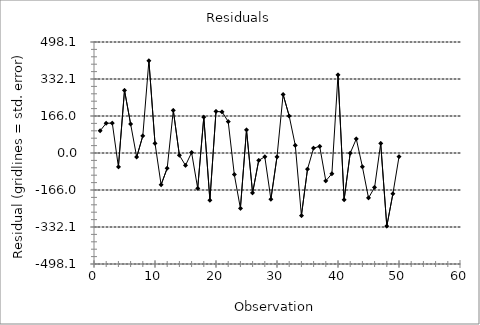
| Category | Series 0 |
|---|---|
| 1.0 | 99.434 |
| 2.0 | 133.589 |
| 3.0 | 134.136 |
| 4.0 | -62.296 |
| 5.0 | 281.259 |
| 6.0 | 130.577 |
| 7.0 | -18.088 |
| 8.0 | 76.675 |
| 9.0 | 414.067 |
| 10.0 | 43.638 |
| 11.0 | -142.492 |
| 12.0 | -68.313 |
| 13.0 | 191.259 |
| 14.0 | -10.472 |
| 15.0 | -55.492 |
| 16.0 | 1.969 |
| 17.0 | -158.533 |
| 18.0 | 160.806 |
| 19.0 | -211.909 |
| 20.0 | 186.271 |
| 21.0 | 184.552 |
| 22.0 | 140.989 |
| 23.0 | -96.525 |
| 24.0 | -248.399 |
| 25.0 | 103.291 |
| 26.0 | -178.896 |
| 27.0 | -33.256 |
| 28.0 | -16.909 |
| 29.0 | -207.435 |
| 30.0 | -16.966 |
| 31.0 | 262.752 |
| 32.0 | 165.887 |
| 33.0 | 34.042 |
| 34.0 | -280.966 |
| 35.0 | -72.517 |
| 36.0 | 21.977 |
| 37.0 | 29.879 |
| 38.0 | -125.068 |
| 39.0 | -92.856 |
| 40.0 | 350.806 |
| 41.0 | -210.145 |
| 42.0 | -0.656 |
| 43.0 | 63.099 |
| 44.0 | -61.737 |
| 45.0 | -201.807 |
| 46.0 | -154.292 |
| 47.0 | 42.846 |
| 48.0 | -328.162 |
| 49.0 | -182.819 |
| 50.0 | -16.794 |